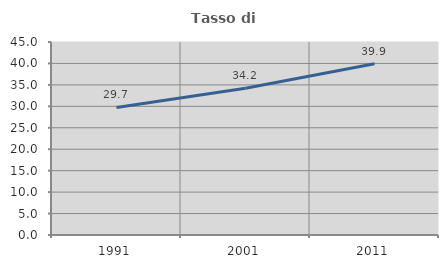
| Category | Tasso di occupazione   |
|---|---|
| 1991.0 | 29.744 |
| 2001.0 | 34.226 |
| 2011.0 | 39.922 |